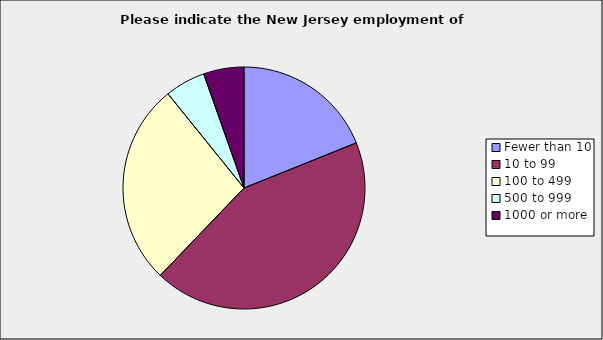
| Category | Series 0 |
|---|---|
| Fewer than 10 | 0.189 |
| 10 to 99 | 0.432 |
| 100 to 499 | 0.27 |
| 500 to 999 | 0.054 |
| 1000 or more | 0.054 |